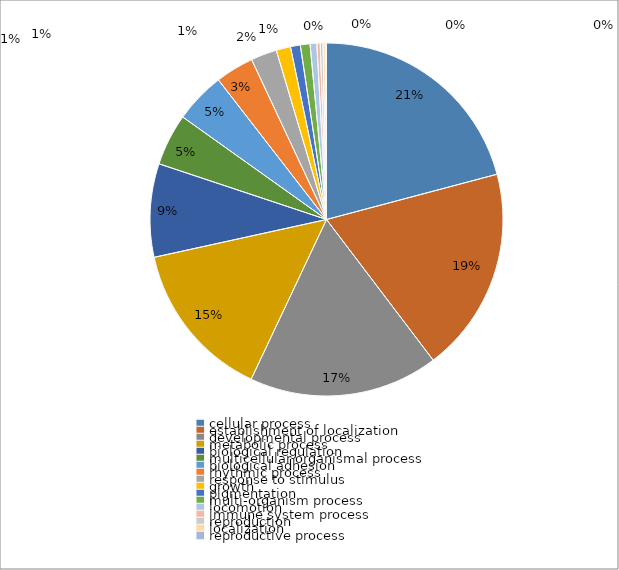
| Category | Series 0 |
|---|---|
| cellular process | 20.87 |
| establishment of localization | 18.802 |
| developmental process | 17.343 |
| metabolic process | 14.546 |
| biological regulation | 8.547 |
| multicellular organismal process | 4.748 |
| biological adhesion | 4.656 |
| rhythmic process | 3.517 |
| response to stimulus | 2.379 |
| growth | 1.313 |
| pigmentation | 0.905 |
| multi-organism process | 0.885 |
| locomotion | 0.613 |
| immune system process | 0.306 |
| reproduction | 0.248 |
| localization | 0.204 |
| reproductive process | 0.117 |